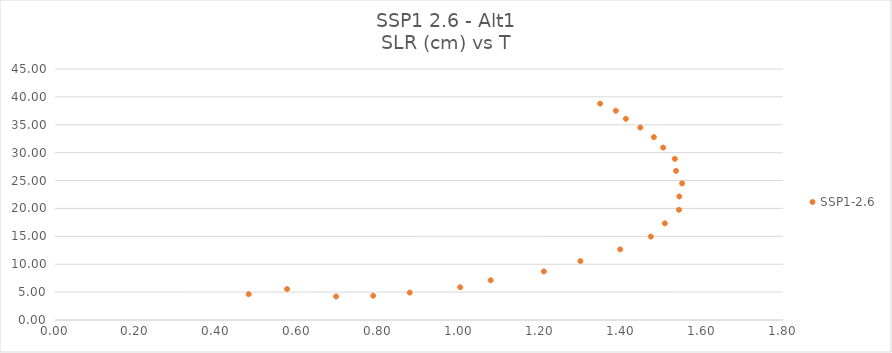
| Category | SSP1-2.6 |
|---|---|
| 0.573801925 | 5.549 |
| 0.479031654 | 4.625 |
| 0.695197934 | 4.219 |
| 0.786748548 | 4.353 |
| 0.877021499 | 4.915 |
| 1.001823785 | 5.869 |
| 1.077169017 | 7.122 |
| 1.208724293 | 8.712 |
| 1.299109785 | 10.562 |
| 1.397495444 | 12.664 |
| 1.473131374 | 14.956 |
| 1.507828993 | 17.328 |
| 1.542775668 | 19.757 |
| 1.54363856 | 22.146 |
| 1.550439426 | 24.493 |
| 1.535641485 | 26.735 |
| 1.532592879 | 28.895 |
| 1.50366724 | 30.907 |
| 1.480677226 | 32.785 |
| 1.447228591 | 34.507 |
| 1.411462352 | 36.071 |
| 1.386572925 | 37.509 |
| 1.347980905 | 38.794 |